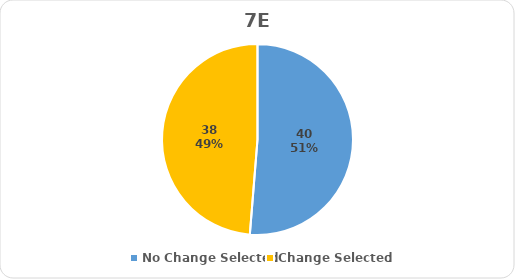
| Category | Series 0 |
|---|---|
| No Change Selected | 40 |
| Change Selected | 38 |